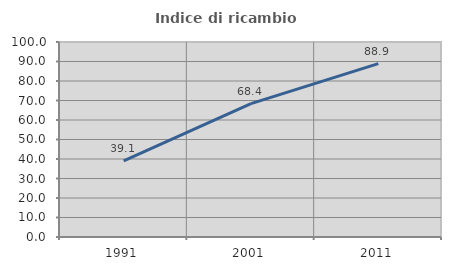
| Category | Indice di ricambio occupazionale  |
|---|---|
| 1991.0 | 39.062 |
| 2001.0 | 68.421 |
| 2011.0 | 88.889 |